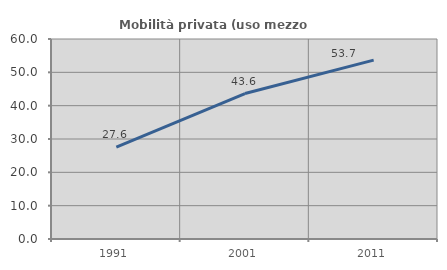
| Category | Mobilità privata (uso mezzo privato) |
|---|---|
| 1991.0 | 27.554 |
| 2001.0 | 43.627 |
| 2011.0 | 53.653 |